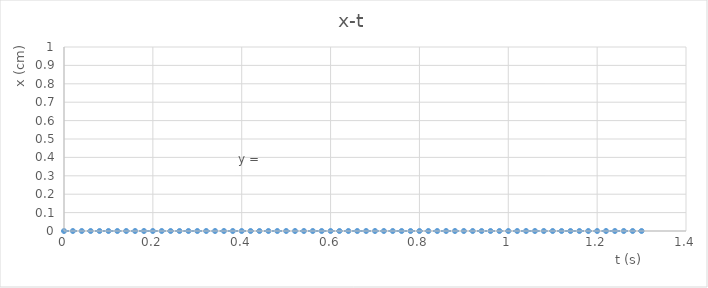
| Category | x(cm) |
|---|---|
| 0.0 | 0 |
| 0.02 | 0 |
| 0.04 | 0 |
| 0.06 | 0 |
| 0.08 | 0 |
| 0.1 | 0 |
| 0.12000000000000001 | 0 |
| 0.14 | 0 |
| 0.16 | 0 |
| 0.18 | 0 |
| 0.19999999999999998 | 0 |
| 0.21999999999999997 | 0 |
| 0.23999999999999996 | 0 |
| 0.25999999999999995 | 0 |
| 0.27999999999999997 | 0 |
| 0.3 | 0 |
| 0.32 | 0 |
| 0.34 | 0 |
| 0.36000000000000004 | 0 |
| 0.38000000000000006 | 0 |
| 0.4000000000000001 | 0 |
| 0.4200000000000001 | 0 |
| 0.4400000000000001 | 0 |
| 0.46000000000000013 | 0 |
| 0.48000000000000015 | 0 |
| 0.5000000000000001 | 0 |
| 0.5200000000000001 | 0 |
| 0.5400000000000001 | 0 |
| 0.5600000000000002 | 0 |
| 0.5800000000000002 | 0 |
| 0.6000000000000002 | 0 |
| 0.6200000000000002 | 0 |
| 0.6400000000000002 | 0 |
| 0.6600000000000003 | 0 |
| 0.6800000000000003 | 0 |
| 0.7000000000000003 | 0 |
| 0.7200000000000003 | 0 |
| 0.7400000000000003 | 0 |
| 0.7600000000000003 | 0 |
| 0.7800000000000004 | 0 |
| 0.8000000000000004 | 0 |
| 0.8200000000000004 | 0 |
| 0.8400000000000004 | 0 |
| 0.8600000000000004 | 0 |
| 0.8800000000000004 | 0 |
| 0.9000000000000005 | 0 |
| 0.9200000000000005 | 0 |
| 0.9400000000000005 | 0 |
| 0.9600000000000005 | 0 |
| 0.9800000000000005 | 0 |
| 1.0000000000000004 | 0 |
| 1.0200000000000005 | 0 |
| 1.0400000000000005 | 0 |
| 1.0600000000000005 | 0 |
| 1.0800000000000005 | 0 |
| 1.1000000000000005 | 0 |
| 1.1200000000000006 | 0 |
| 1.1400000000000006 | 0 |
| 1.1600000000000006 | 0 |
| 1.1800000000000006 | 0 |
| 1.2000000000000006 | 0 |
| 1.2200000000000006 | 0 |
| 1.2400000000000007 | 0 |
| 1.2600000000000007 | 0 |
| 1.2800000000000007 | 0 |
| 1.3000000000000007 | 0 |